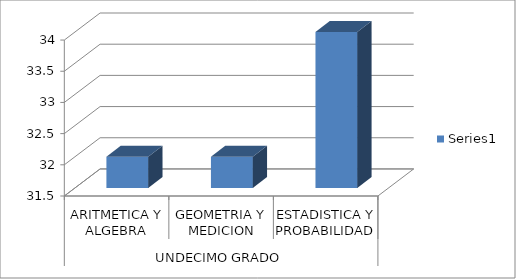
| Category | Series 0 |
|---|---|
| 0 | 32 |
| 1 | 32 |
| 2 | 34 |